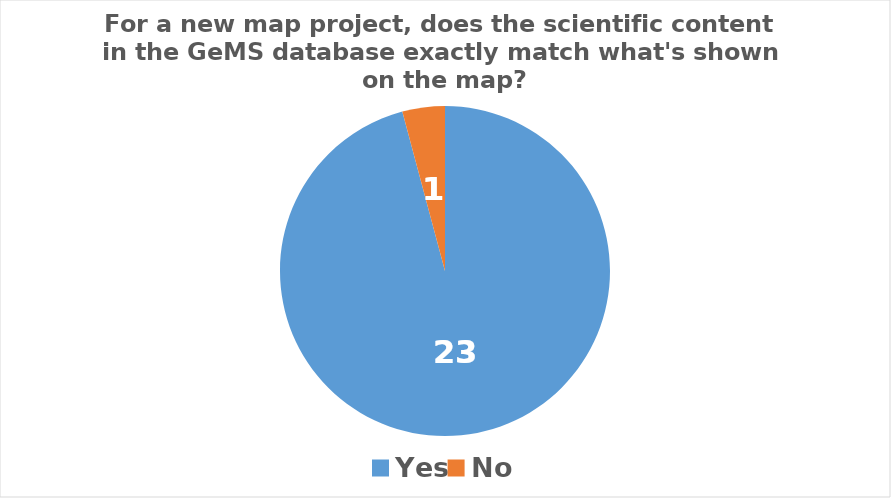
| Category | Series 0 |
|---|---|
| Yes | 23 |
| No | 1 |